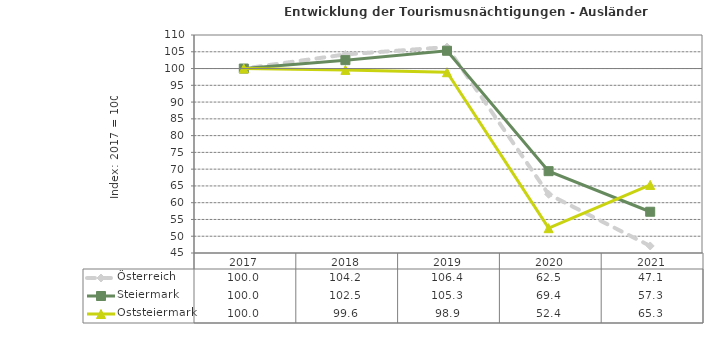
| Category | Österreich | Steiermark | Oststeiermark |
|---|---|---|---|
| 2021.0 | 47.1 | 57.3 | 65.3 |
| 2020.0 | 62.5 | 69.4 | 52.4 |
| 2019.0 | 106.4 | 105.3 | 98.9 |
| 2018.0 | 104.2 | 102.5 | 99.6 |
| 2017.0 | 100 | 100 | 100 |